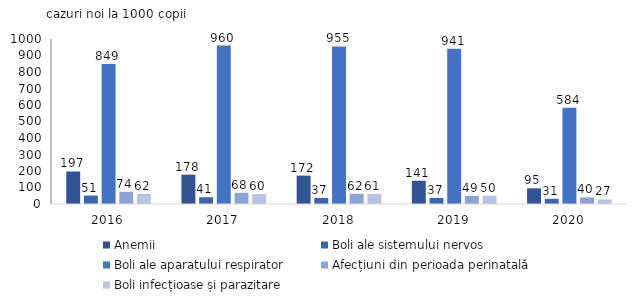
| Category | Anemii | Boli ale sistemului nervos | Boli ale aparatului respirator | Afecțiuni din perioada perinatală | Boli infecțioase și parazitare |
|---|---|---|---|---|---|
| 2016.0 | 197 | 51 | 849 | 74 | 61.8 |
| 2017.0 | 178 | 41 | 960 | 68 | 60.2 |
| 2018.0 | 172 | 37 | 955 | 62 | 61.498 |
| 2019.0 | 141 | 37 | 941 | 49 | 50.2 |
| 2020.0 | 95 | 31.3 | 583.9 | 39.8 | 27.4 |